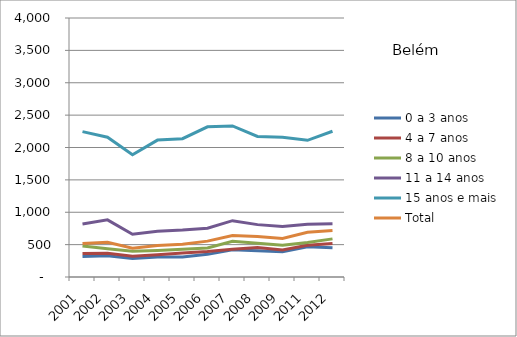
| Category | 0 a 3 anos | 4 a 7 anos | 8 a 10 anos | 11 a 14 anos | 15 anos e mais | Total |
|---|---|---|---|---|---|---|
| 2001.0 | 317.57 | 363.07 | 478.31 | 817.24 | 2245.61 | 515.94 |
| 2002.0 | 329.94 | 365.84 | 435.69 | 882.21 | 2159.66 | 536.18 |
| 2003.0 | 285.82 | 322.33 | 396.6 | 660.77 | 1888.46 | 444.98 |
| 2004.0 | 308.51 | 343.77 | 408.35 | 708.22 | 2114.37 | 487.53 |
| 2005.0 | 310.44 | 368.9 | 426.7 | 725.9 | 2136.61 | 504.29 |
| 2006.0 | 349.7 | 392.3 | 446.84 | 753.12 | 2318.8 | 553.86 |
| 2007.0 | 421.68 | 427.56 | 551.73 | 869.67 | 2332.64 | 641.78 |
| 2008.0 | 403.56 | 456.46 | 519.8 | 808.78 | 2170.08 | 625.89 |
| 2009.0 | 389.24 | 418.49 | 489.07 | 779.81 | 2158.73 | 595.83 |
| 2011.0 | 468.39 | 491.07 | 532 | 814.17 | 2110.95 | 691.24 |
| 2012.0 | 451.86 | 518.29 | 588.62 | 821.35 | 2251.01 | 717.32 |